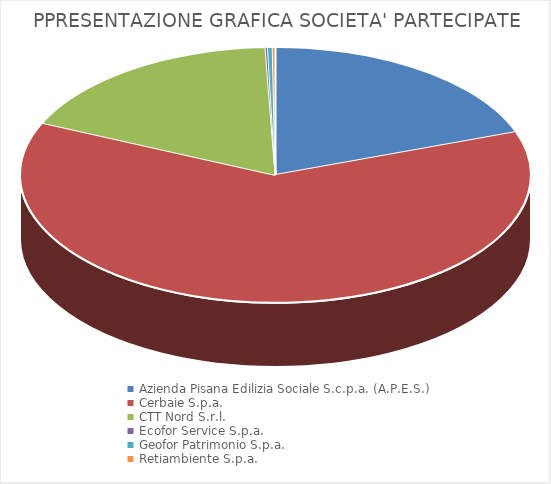
| Category | Series 0 |
|---|---|
| Azienda Pisana Edilizia Sociale S.c.p.a. (A.P.E.S.) | 1.3 |
| Cerbaie S.p.a. | 4.13 |
| CTT Nord S.r.l. | 1.177 |
| Ecofor Service S.p.a. | 0.01 |
| Geofor Patrimonio S.p.a. | 0.02 |
| Retiambiente S.p.a. | 0.012 |